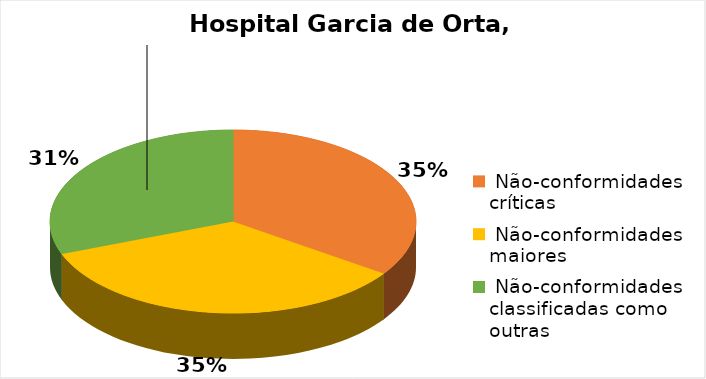
| Category | Hospital Garcia de Orta, E.P.E. |
|---|---|
|  Não-conformidades críticas | 9 |
|  Não-conformidades maiores | 9 |
|  Não-conformidades classificadas como outras | 8 |